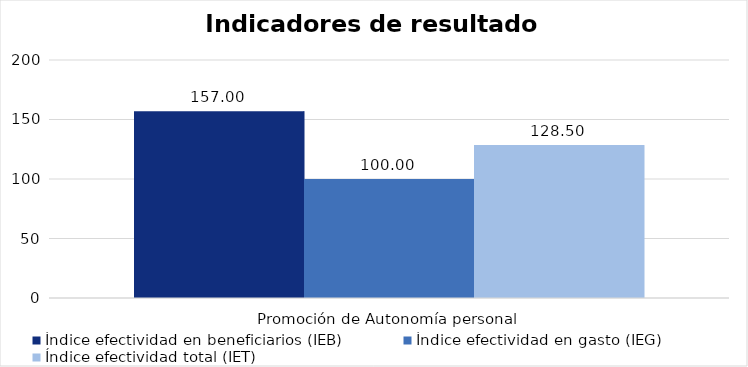
| Category | Índice efectividad en beneficiarios (IEB) | Índice efectividad en gasto (IEG)  | Índice efectividad total (IET) |
|---|---|---|---|
| Promoción de Autonomía personal  | 157 | 100 | 128.5 |